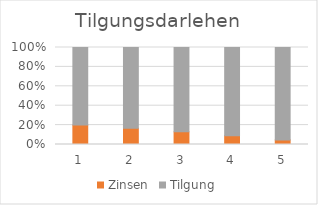
| Category | Zinsen | Tilgung |
|---|---|---|
| 0 | 5000 | 20000 |
| 1 | 4000 | 20000 |
| 2 | 3000 | 20000 |
| 3 | 2000 | 20000 |
| 4 | 1000 | 20000 |